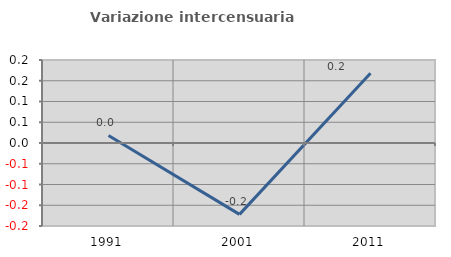
| Category | Variazione intercensuaria annua |
|---|---|
| 1991.0 | 0.018 |
| 2001.0 | -0.172 |
| 2011.0 | 0.168 |